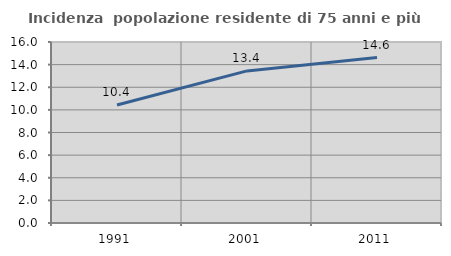
| Category | Incidenza  popolazione residente di 75 anni e più |
|---|---|
| 1991.0 | 10.428 |
| 2001.0 | 13.445 |
| 2011.0 | 14.621 |